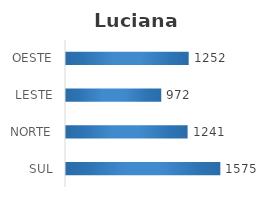
| Category | Series 0 |
|---|---|
| SUL | 1575 |
| NORTE | 1241 |
| LESTE | 972 |
| OESTE | 1252 |